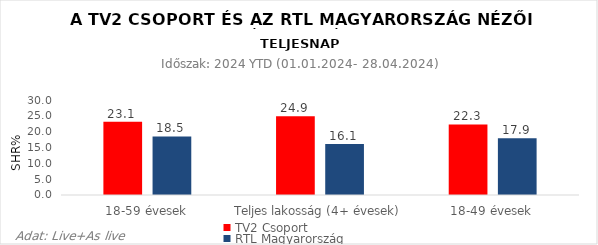
| Category | TV2 Csoport | RTL Magyarország |
|---|---|---|
| 18-59 évesek | 23.1 | 18.5 |
| Teljes lakosság (4+ évesek) | 24.9 | 16.1 |
| 18-49 évesek | 22.3 | 17.9 |